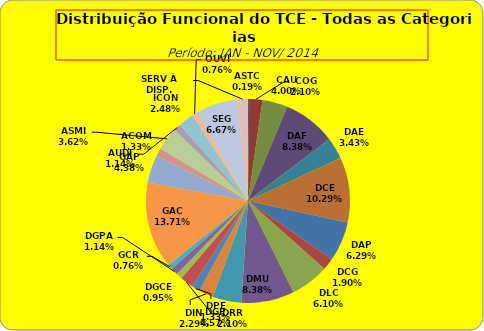
| Category | ASTC COG CAU DAF DAE DCE DAP DCG DLC DMU DGP DIN DPE DRR DGCE DGPA GCR GAC GAP ACOM ASMI AUDI ICON OUVI SEG SERV À DISP. |
|---|---|
| ASTC | 1 |
| COG | 11 |
| CAU | 21 |
| DAF | 44 |
| DAE | 18 |
| DCE | 54 |
| DAP | 33 |
| DCG | 10 |
| DLC | 32 |
| DMU | 44 |
| DGP | 24 |
| DIN | 12 |
| DPE | 7 |
| DRR | 11 |
| DGCE | 5 |
| DGPA | 6 |
| GCR | 4 |
| GAC | 72 |
| GAP | 23 |
| ACOM | 7 |
| ASMI | 19 |
| AUDI | 6 |
| ICON | 13 |
| OUVI | 4 |
| SEG | 35 |
| SERV À DISP. | 9 |